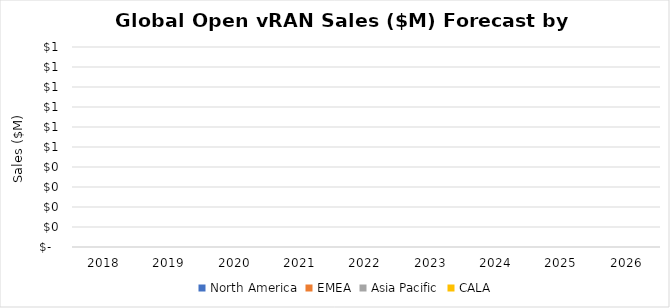
| Category | North America | EMEA | Asia Pacific | CALA |
|---|---|---|---|---|
| 2018.0 | 0 | 0 | 0 | 0 |
| 2019.0 | 0 | 0 | 0 | 0 |
| 2020.0 | 0 | 0 | 0 | 0 |
| 2021.0 | 0 | 0 | 0 | 0 |
| 2022.0 | 0 | 0 | 0 | 0 |
| 2023.0 | 0 | 0 | 0 | 0 |
| 2024.0 | 0 | 0 | 0 | 0 |
| 2025.0 | 0 | 0 | 0 | 0 |
| 2026.0 | 0 | 0 | 0 | 0 |